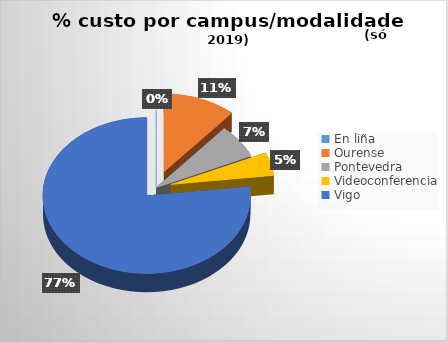
| Category | Custo |
|---|---|
| En liña | 0 |
| Ourense | 3207.64 |
| Pontevedra | 1971.74 |
| Videoconferencia | 1360.79 |
| Vigo | 21725.35 |